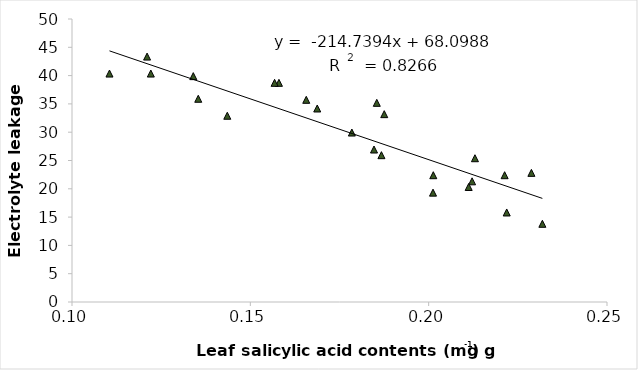
| Category | Electrolyte leakage  |
|---|---|
| 0.11050600000000001 | 40.36 |
| 0.134 | 39.906 |
| 0.15802358 | 38.721 |
| 0.185454502 | 35.189 |
| 0.18675514 | 25.939 |
| 0.20129772959999997 | 22.401 |
| 0.21217152 | 21.322 |
| 0.22880188 | 22.816 |
| 0.1210506 | 43.36 |
| 0.1354 | 35.906 |
| 0.156802358 | 38.721 |
| 0.1875454502 | 33.189 |
| 0.184675514 | 26.939 |
| 0.2212977296 | 22.401 |
| 0.201217152 | 19.322 |
| 0.221880188 | 15.816 |
| 0.12210506 | 40.36 |
| 0.14354 | 32.906 |
| 0.1656802358 | 35.721 |
| 0.16875454502 | 34.189 |
| 0.1784675514 | 29.939 |
| 0.212977296 | 25.401 |
| 0.211217152 | 20.322 |
| 0.231880188 | 13.816 |